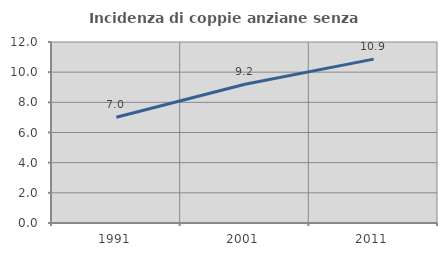
| Category | Incidenza di coppie anziane senza figli  |
|---|---|
| 1991.0 | 7.01 |
| 2001.0 | 9.199 |
| 2011.0 | 10.865 |